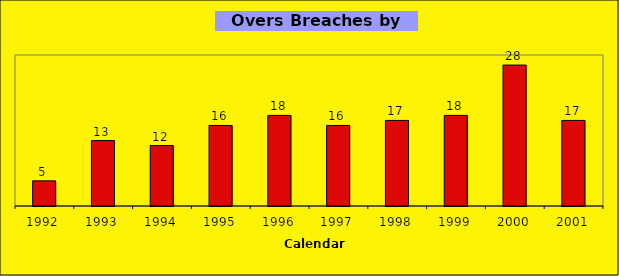
| Category | Series 0 |
|---|---|
| 1992.0 | 5 |
| 1993.0 | 13 |
| 1994.0 | 12 |
| 1995.0 | 16 |
| 1996.0 | 18 |
| 1997.0 | 16 |
| 1998.0 | 17 |
| 1999.0 | 18 |
| 2000.0 | 28 |
| 2001.0 | 17 |